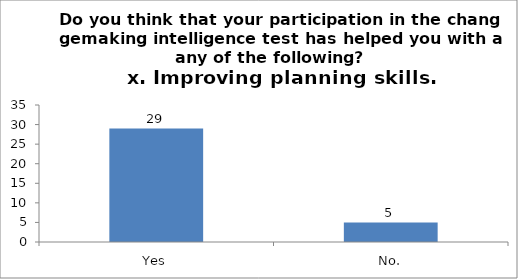
| Category | Do you think that your participation in the changemaking intelligence test has helped you with any of the following?
x. Improving planning skills. |
|---|---|
| Yes | 29 |
| No. | 5 |